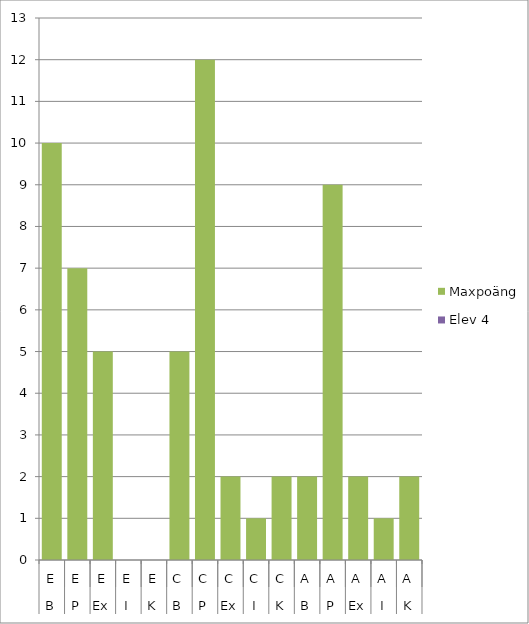
| Category | Maxpoäng | Elev 4 |
|---|---|---|
| 0 | 10 | 0 |
| 1 | 7 | 0 |
| 2 | 5 | 0 |
| 3 | 0 | 0 |
| 4 | 0 | 0 |
| 5 | 5 | 0 |
| 6 | 12 | 0 |
| 7 | 2 | 0 |
| 8 | 1 | 0 |
| 9 | 2 | 0 |
| 10 | 2 | 0 |
| 11 | 9 | 0 |
| 12 | 2 | 0 |
| 13 | 1 | 0 |
| 14 | 2 | 0 |